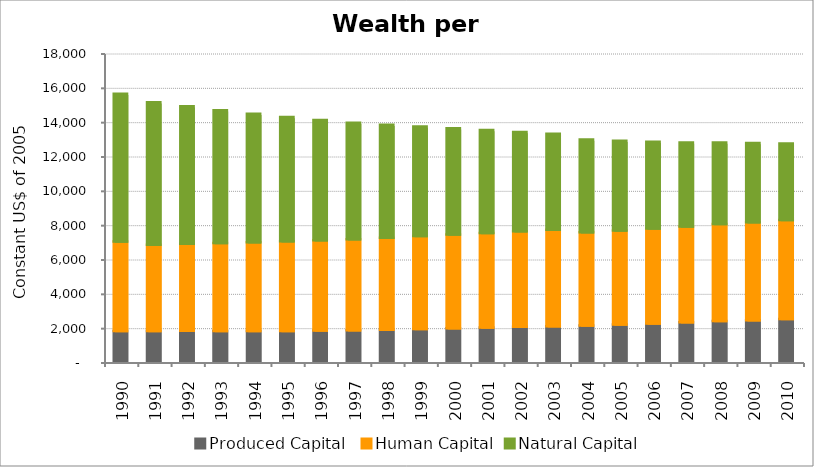
| Category | Produced Capital  | Human Capital | Natural Capital |
|---|---|---|---|
| 1990.0 | 1798.482 | 5207.046 | 8608.37 |
| 1991.0 | 1798.31 | 5021.716 | 8297.054 |
| 1992.0 | 1802.11 | 5068.12 | 8012.683 |
| 1993.0 | 1795.849 | 5118.577 | 7737.853 |
| 1994.0 | 1795.645 | 5172.043 | 7479.568 |
| 1995.0 | 1798.274 | 5223.278 | 7230.082 |
| 1996.0 | 1815.966 | 5265.117 | 7000.746 |
| 1997.0 | 1829.301 | 5311.35 | 6786.37 |
| 1998.0 | 1867.838 | 5359.723 | 6581.455 |
| 1999.0 | 1913.908 | 5409.268 | 6383.679 |
| 2000.0 | 1954.139 | 5459.534 | 6187.785 |
| 2001.0 | 1995.778 | 5509.675 | 5988.351 |
| 2002.0 | 2033.849 | 5563.641 | 5789.182 |
| 2003.0 | 2070.254 | 5615.617 | 5589.149 |
| 2004.0 | 2115.207 | 5433.649 | 5403.605 |
| 2005.0 | 2163.148 | 5486.128 | 5225.941 |
| 2006.0 | 2227.101 | 5536.724 | 5048.578 |
| 2007.0 | 2296.409 | 5589.375 | 4885.733 |
| 2008.0 | 2371.952 | 5645.78 | 4757.803 |
| 2009.0 | 2420.479 | 5706.051 | 4613.59 |
| 2010.0 | 2484.634 | 5768.891 | 4465.809 |